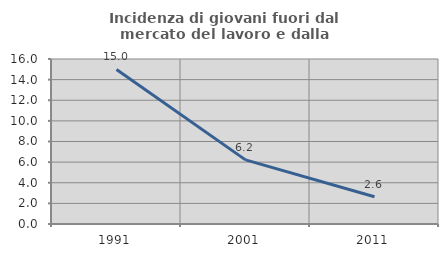
| Category | Incidenza di giovani fuori dal mercato del lavoro e dalla formazione  |
|---|---|
| 1991.0 | 14.988 |
| 2001.0 | 6.219 |
| 2011.0 | 2.639 |